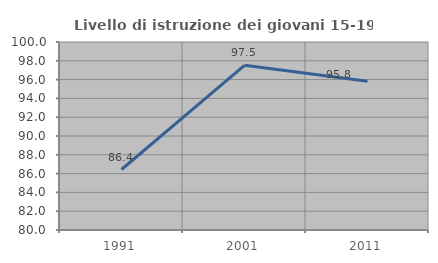
| Category | Livello di istruzione dei giovani 15-19 anni |
|---|---|
| 1991.0 | 86.436 |
| 2001.0 | 97.523 |
| 2011.0 | 95.816 |